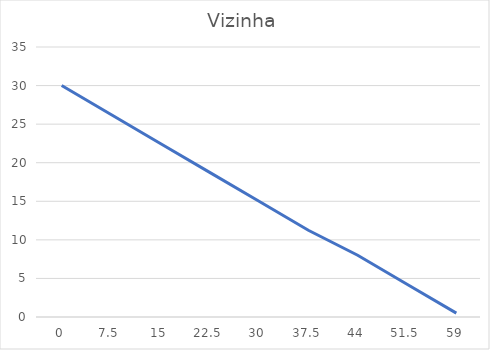
| Category | maça |
|---|---|
| 0.0 | 30 |
| 7.5 | 26.25 |
| 15.0 | 22.5 |
| 22.5 | 18.75 |
| 30.0 | 15 |
| 37.5 | 11.25 |
| 44.0 | 8 |
| 51.5 | 4.25 |
| 59.0 | 0.5 |